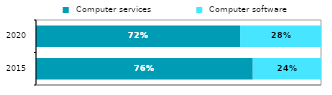
| Category |  Computer services |  Computer software |
|---|---|---|
|  2015 | 0.761 | 0.239 |
|  2020 | 0.716 | 0.284 |